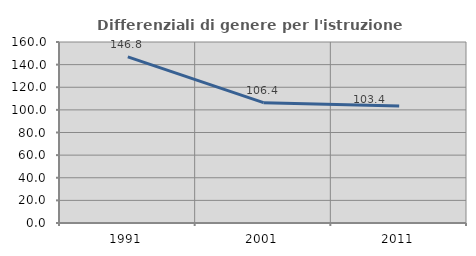
| Category | Differenziali di genere per l'istruzione superiore |
|---|---|
| 1991.0 | 146.796 |
| 2001.0 | 106.397 |
| 2011.0 | 103.388 |